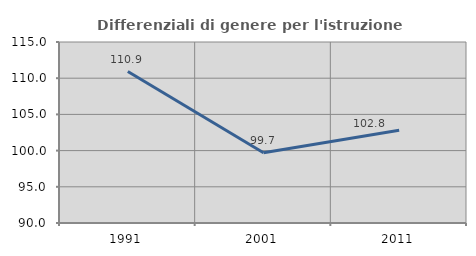
| Category | Differenziali di genere per l'istruzione superiore |
|---|---|
| 1991.0 | 110.918 |
| 2001.0 | 99.705 |
| 2011.0 | 102.815 |